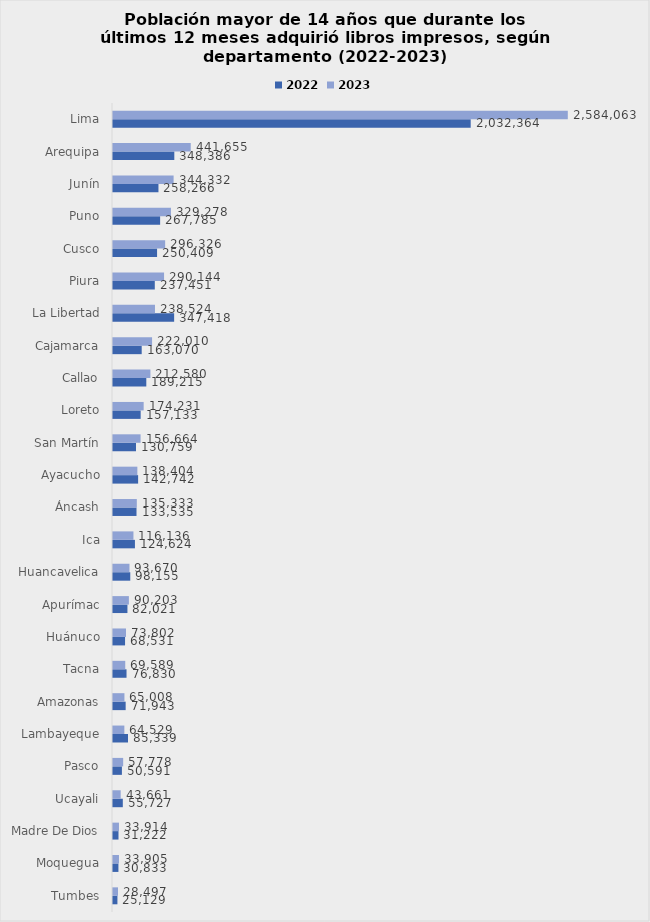
| Category | 2022 | 2023 |
|---|---|---|
| Tumbes | 25129 | 28497 |
| Moquegua | 30833 | 33905 |
| Madre De Dios | 31222 | 33914 |
| Ucayali | 55727 | 43661 |
| Pasco | 50591 | 57778 |
| Lambayeque | 85339 | 64529 |
| Amazonas | 71943 | 65008 |
| Tacna | 76830 | 69589 |
| Huánuco | 68531 | 73802 |
| Apurímac | 82021 | 90203 |
| Huancavelica | 98155 | 93670 |
| Ica | 124624 | 116136 |
| Áncash | 133535 | 135333 |
| Ayacucho | 142742 | 138404 |
| San Martín | 130759 | 156664 |
| Loreto | 157133 | 174231 |
| Callao | 189215 | 212580 |
| Cajamarca | 163070 | 222010 |
| La Libertad | 347418 | 238524 |
| Piura | 237451 | 290144 |
| Cusco | 250409 | 296326 |
| Puno | 267785 | 329278 |
| Junín | 258266 | 344332 |
| Arequipa | 348386 | 441655 |
| Lima | 2032364 | 2584063 |